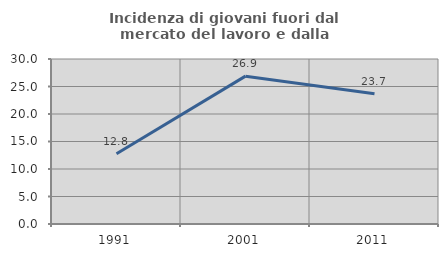
| Category | Incidenza di giovani fuori dal mercato del lavoro e dalla formazione  |
|---|---|
| 1991.0 | 12.774 |
| 2001.0 | 26.882 |
| 2011.0 | 23.699 |